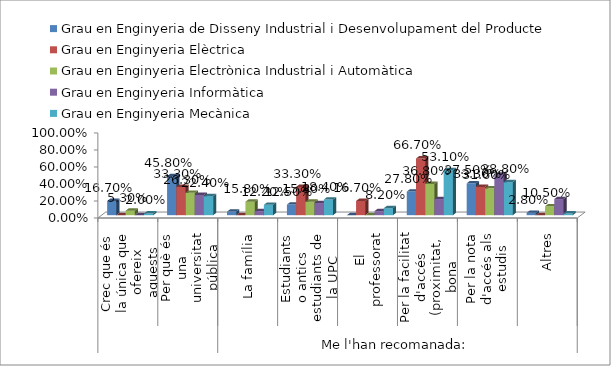
| Category | Grau en Enginyeria de Disseny Industrial i Desenvolupament del Producte | Grau en Enginyeria Elèctrica | Grau en Enginyeria Electrònica Industrial i Automàtica | Grau en Enginyeria Informàtica | Grau en Enginyeria Mecànica |
|---|---|---|---|---|---|
| 0 | 0.167 | 0 | 0.053 | 0 | 0.02 |
| 1 | 0.458 | 0.333 | 0.263 | 0.238 | 0.224 |
| 2 | 0.042 | 0 | 0.158 | 0.048 | 0.122 |
| 3 | 0.125 | 0.333 | 0.158 | 0.143 | 0.184 |
| 4 | 0 | 0.167 | 0 | 0.048 | 0.082 |
| 5 | 0.278 | 0.667 | 0.368 | 0.19 | 0.531 |
| 6 | 0.375 | 0.333 | 0.316 | 0.476 | 0.388 |
| 7 | 0.028 | 0 | 0.105 | 0.19 | 0.02 |